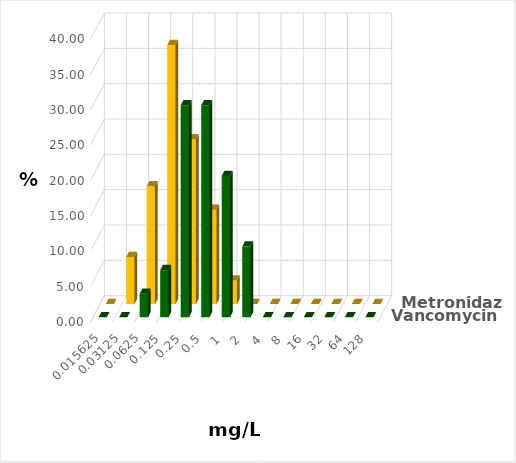
| Category | Vancomycin | Metronidazol |
|---|---|---|
| 0.015625 | 0 | 0 |
| 0.03125 | 0 | 6.667 |
| 0.0625 | 3.333 | 16.667 |
| 0.125 | 6.667 | 36.667 |
| 0.25 | 30 | 23.333 |
| 0.5 | 30 | 13.333 |
| 1.0 | 20 | 3.333 |
| 2.0 | 10 | 0 |
| 4.0 | 0 | 0 |
| 8.0 | 0 | 0 |
| 16.0 | 0 | 0 |
| 32.0 | 0 | 0 |
| 64.0 | 0 | 0 |
| 128.0 | 0 | 0 |